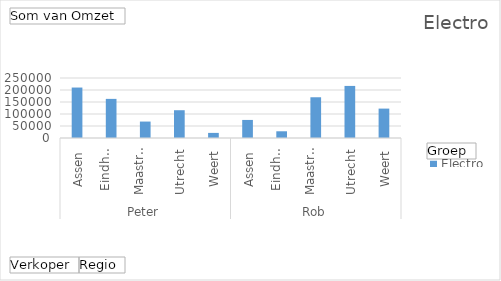
| Category | Electro |
|---|---|
| 0 | 210250 |
| 1 | 163000 |
| 2 | 68500 |
| 3 | 115750 |
| 4 | 21250 |
| 5 | 75250 |
| 6 | 28000 |
| 7 | 169750 |
| 8 | 217000 |
| 9 | 122500 |